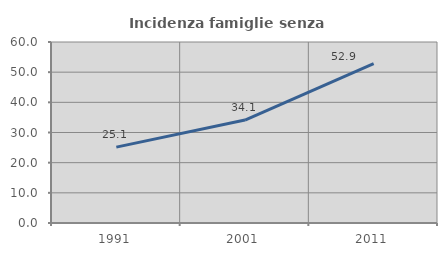
| Category | Incidenza famiglie senza nuclei |
|---|---|
| 1991.0 | 25.143 |
| 2001.0 | 34.127 |
| 2011.0 | 52.868 |